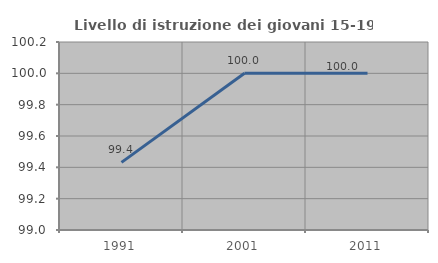
| Category | Livello di istruzione dei giovani 15-19 anni |
|---|---|
| 1991.0 | 99.432 |
| 2001.0 | 100 |
| 2011.0 | 100 |